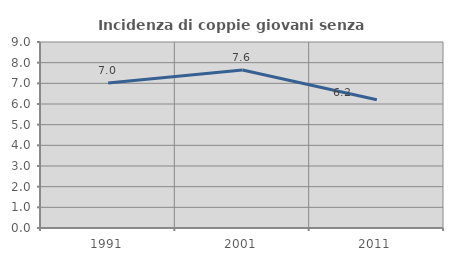
| Category | Incidenza di coppie giovani senza figli |
|---|---|
| 1991.0 | 7.016 |
| 2001.0 | 7.641 |
| 2011.0 | 6.21 |